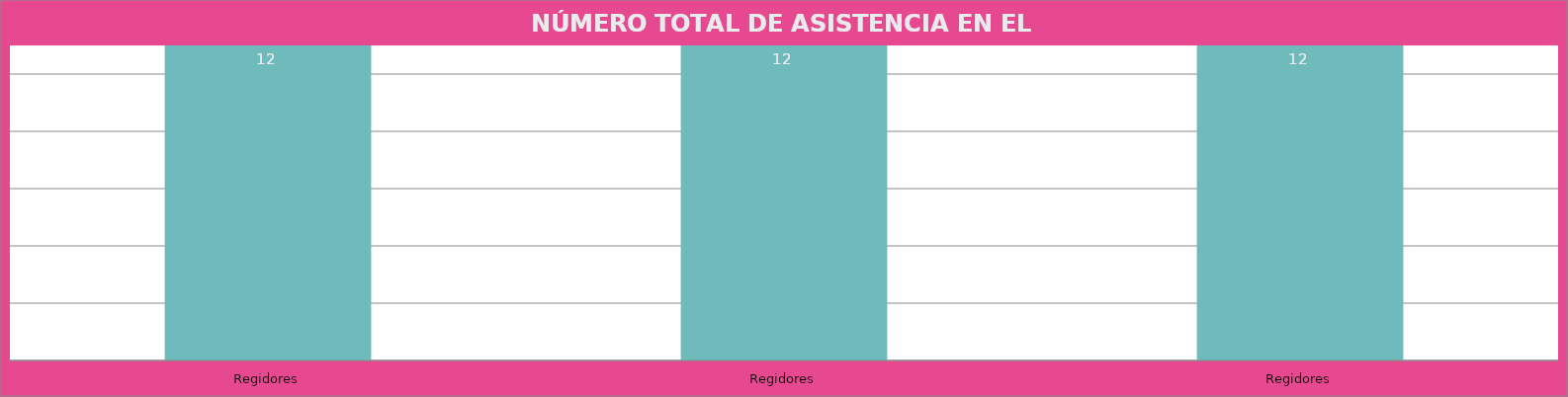
| Category | Regidores |
|---|---|
| Regidores | 12 |
| Regidores | 12 |
| Regidores | 12 |